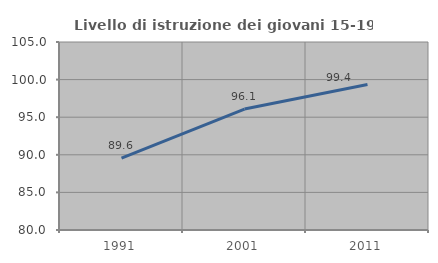
| Category | Livello di istruzione dei giovani 15-19 anni |
|---|---|
| 1991.0 | 89.565 |
| 2001.0 | 96.087 |
| 2011.0 | 99.355 |